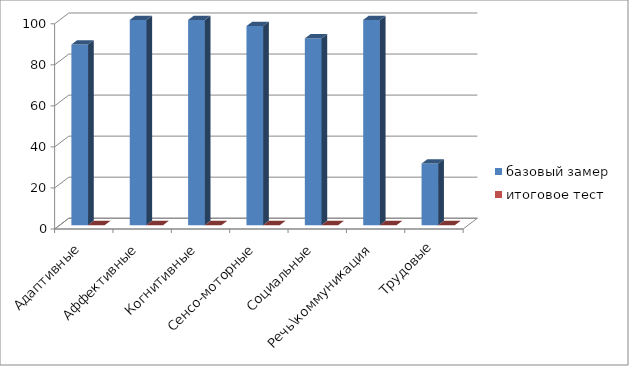
| Category | базовый замер | итоговое тест |
|---|---|---|
| Адаптивные | 88 | 0 |
| Аффективные | 100 | 0 |
| Когнитивные | 100 | 0 |
| Сенсо-моторные | 97 | 0 |
| Социальные | 91 | 0 |
| Речь\коммуникация | 100 | 0 |
| Трудовые | 30 | 0 |